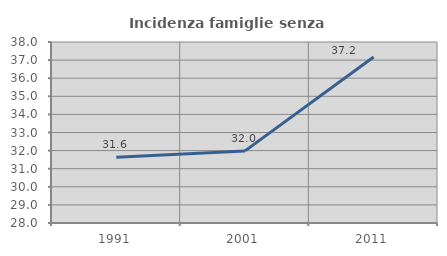
| Category | Incidenza famiglie senza nuclei |
|---|---|
| 1991.0 | 31.629 |
| 2001.0 | 31.985 |
| 2011.0 | 37.168 |